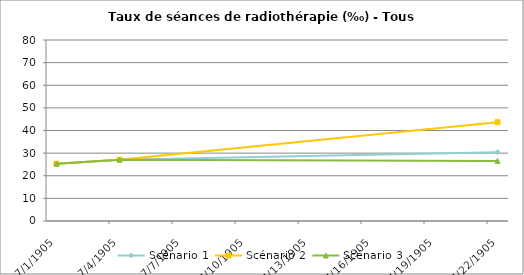
| Category | Scénario 1 | Scénario 2 | Scénario 3 |
|---|---|---|---|
| 2009.0 | 25.336 | 25.336 | 25.336 |
| 2012.0 | 27.12 | 27.12 | 27.12 |
| 2030.0 | 30.386 | 43.67 | 26.567 |